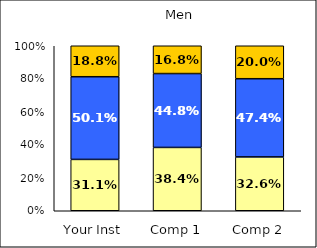
| Category | Low Academic Self-Concept | Average Academic Self-Concept | High Academic Self-Concept |
|---|---|---|---|
| Your Inst | 0.311 | 0.501 | 0.188 |
| Comp 1 | 0.384 | 0.448 | 0.168 |
| Comp 2 | 0.326 | 0.474 | 0.2 |